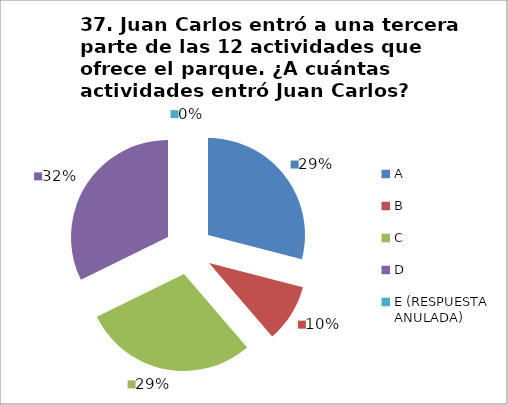
| Category | CANTIDAD DE RESPUESTAS PREGUNTA (37) | PORCENTAJE |
|---|---|---|
| A | 9 | 0.29 |
| B | 3 | 0.097 |
| C | 9 | 0.29 |
| D | 10 | 0.323 |
| E (RESPUESTA ANULADA) | 0 | 0 |